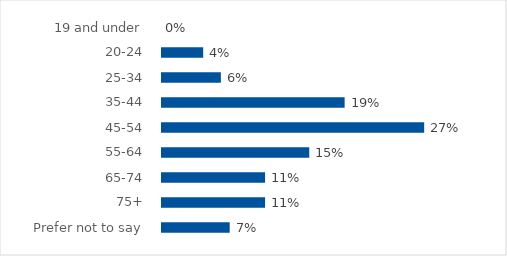
| Category | Series 0 |
|---|---|
| 19 and under | 0 |
| 20-24 | 0.045 |
| 25-34 | 0.062 |
| 35-44 | 0.188 |
| 45-54 | 0.268 |
| 55-64 | 0.152 |
| 65-74 | 0.107 |
| 75+ | 0.107 |
| Prefer not to say | 0.071 |